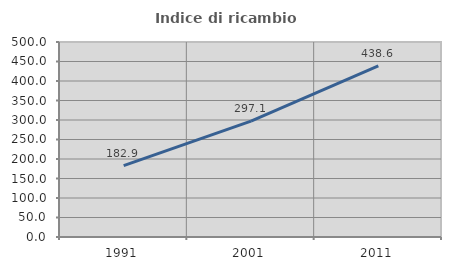
| Category | Indice di ricambio occupazionale  |
|---|---|
| 1991.0 | 182.9 |
| 2001.0 | 297.113 |
| 2011.0 | 438.592 |